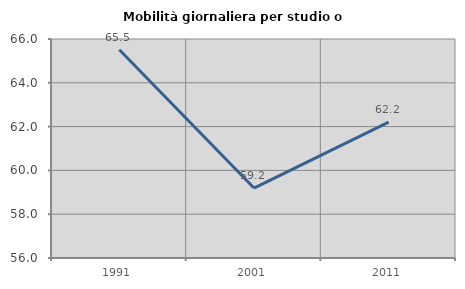
| Category | Mobilità giornaliera per studio o lavoro |
|---|---|
| 1991.0 | 65.509 |
| 2001.0 | 59.193 |
| 2011.0 | 62.204 |